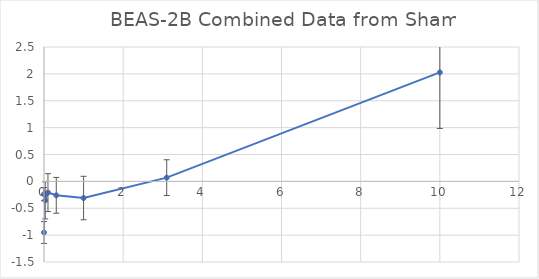
| Category | Combined Data from Sham |
|---|---|
| 10.0 | 2.027 |
| 3.1 | 0.069 |
| 1.0 | -0.31 |
| 0.31 | -0.259 |
| 0.1 | -0.209 |
| 0.031 | -0.352 |
| 0.0 | -0.238 |
| 0.0 | -0.952 |